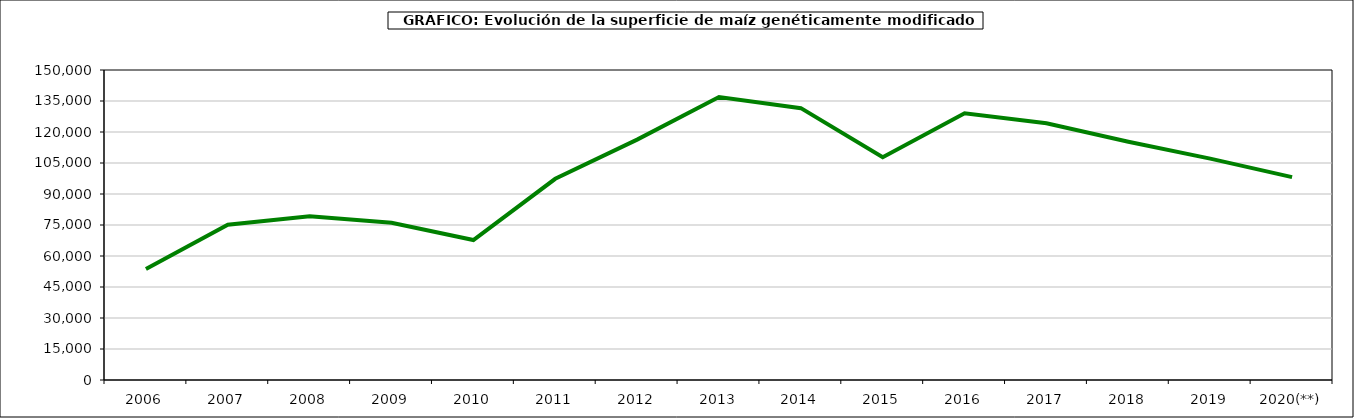
| Category | maiz |
|---|---|
| 2006 | 53667 |
| 2007 | 75148 |
| 2008 | 79269 |
| 2009 | 76057 |
| 2010 | 67726 |
| 2011 | 97346.31 |
| 2012 | 116306.6 |
| 2013 | 136962 |
| 2014 | 131537.67 |
| 2015 | 107749.22 |
| 2016 | 129081.12 |
| 2017 | 124226.87 |
| 2018 | 115246.02 |
| 2019 | 107126.9 |
| 2020(**) | 98151.58 |